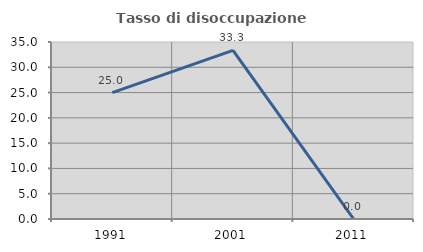
| Category | Tasso di disoccupazione giovanile  |
|---|---|
| 1991.0 | 25 |
| 2001.0 | 33.333 |
| 2011.0 | 0 |